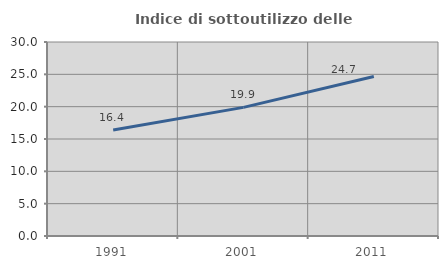
| Category | Indice di sottoutilizzo delle abitazioni  |
|---|---|
| 1991.0 | 16.382 |
| 2001.0 | 19.892 |
| 2011.0 | 24.661 |